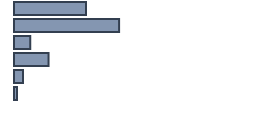
| Category | Percentatge |
|---|---|
| 0 | 30 |
| 1 | 43.788 |
| 2 | 6.742 |
| 3 | 14.394 |
| 4 | 3.788 |
| 5 | 1.288 |
| 6 | 0 |